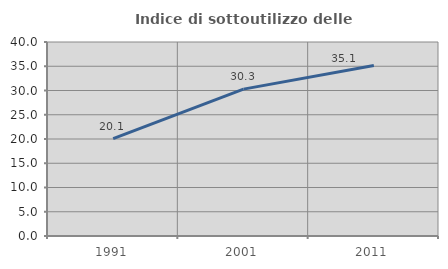
| Category | Indice di sottoutilizzo delle abitazioni  |
|---|---|
| 1991.0 | 20.082 |
| 2001.0 | 30.279 |
| 2011.0 | 35.145 |